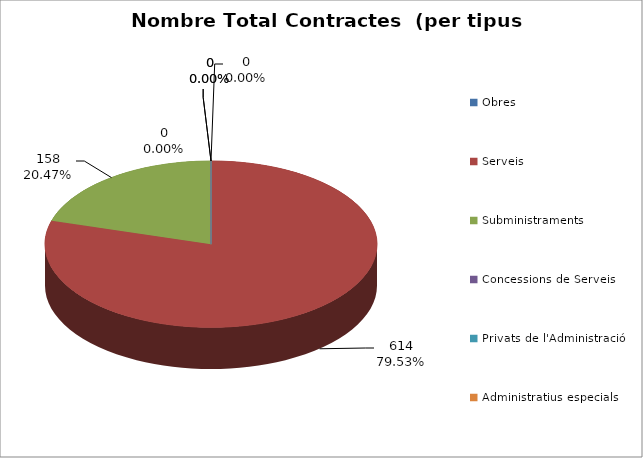
| Category | Nombre Total Contractes |
|---|---|
| Obres | 0 |
| Serveis | 614 |
| Subministraments | 158 |
| Concessions de Serveis | 0 |
| Privats de l'Administració | 0 |
| Administratius especials | 0 |